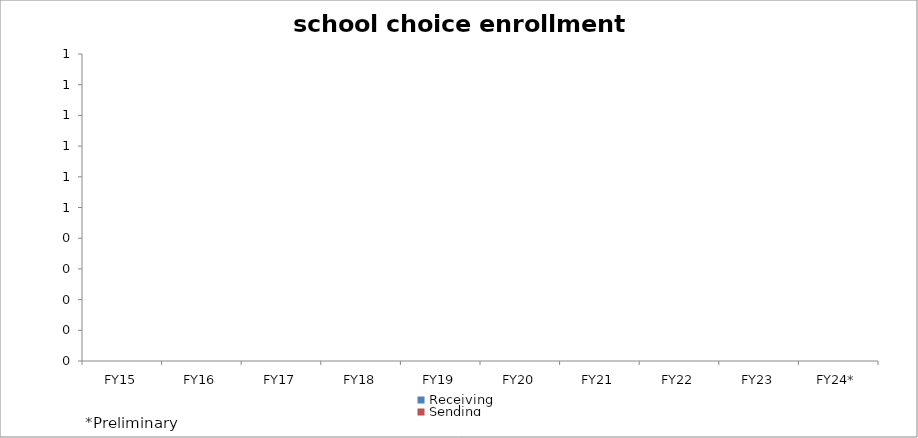
| Category | Receiving  | Sending |
|---|---|---|
| FY15 | 0 | 0 |
| FY16 | 0 | 0 |
| FY17 | 0 | 0 |
| FY18 | 0 | 0 |
| FY19 | 0 | 0 |
| FY20 | 0 | 0 |
| FY21 | 0 | 0 |
| FY22 | 0 | 0 |
| FY23 | 0 | 0 |
| FY24* | 0 | 0 |